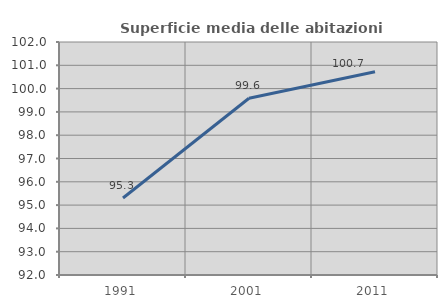
| Category | Superficie media delle abitazioni occupate |
|---|---|
| 1991.0 | 95.307 |
| 2001.0 | 99.584 |
| 2011.0 | 100.722 |